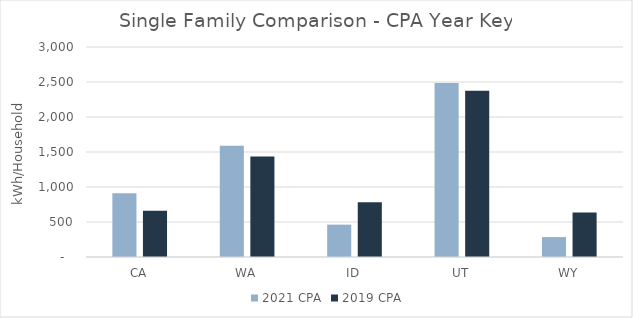
| Category | 2021 CPA | 2019 CPA |
|---|---|---|
| CA | 912.499 | 661.496 |
| WA | 1589.955 | 1434.16 |
| ID | 462.203 | 780.794 |
| UT | 2486.363 | 2375.989 |
| WY | 284.752 | 635.586 |